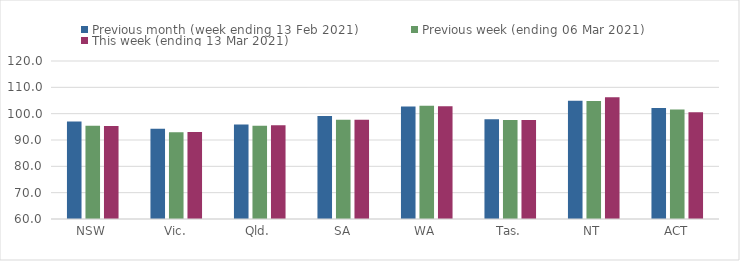
| Category | Previous month (week ending 13 Feb 2021) | Previous week (ending 06 Mar 2021) | This week (ending 13 Mar 2021) |
|---|---|---|---|
| NSW | 97 | 95.4 | 95.34 |
| Vic. | 94.3 | 92.94 | 93.04 |
| Qld. | 95.87 | 95.42 | 95.57 |
| SA | 99.14 | 97.67 | 97.71 |
| WA | 102.76 | 102.98 | 102.85 |
| Tas. | 97.9 | 97.64 | 97.58 |
| NT | 104.87 | 104.82 | 106.22 |
| ACT | 102.11 | 101.55 | 100.5 |